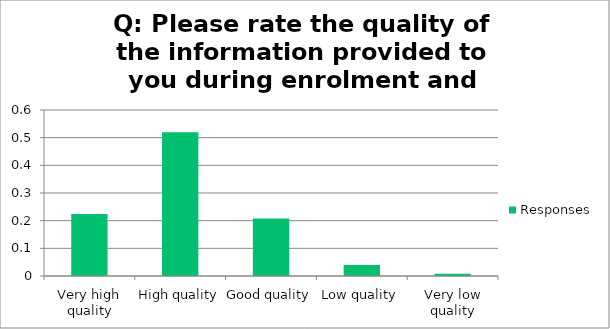
| Category | Responses |
|---|---|
| Very high quality | 0.224 |
| High quality | 0.52 |
| Good quality | 0.208 |
| Low quality | 0.04 |
| Very low quality | 0.008 |